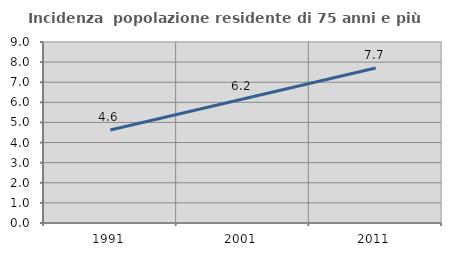
| Category | Incidenza  popolazione residente di 75 anni e più |
|---|---|
| 1991.0 | 4.626 |
| 2001.0 | 6.163 |
| 2011.0 | 7.708 |